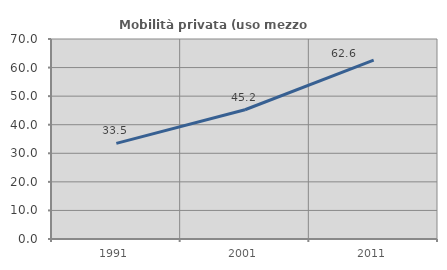
| Category | Mobilità privata (uso mezzo privato) |
|---|---|
| 1991.0 | 33.476 |
| 2001.0 | 45.238 |
| 2011.0 | 62.571 |